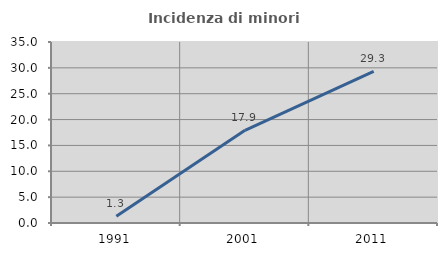
| Category | Incidenza di minori stranieri |
|---|---|
| 1991.0 | 1.307 |
| 2001.0 | 17.92 |
| 2011.0 | 29.328 |